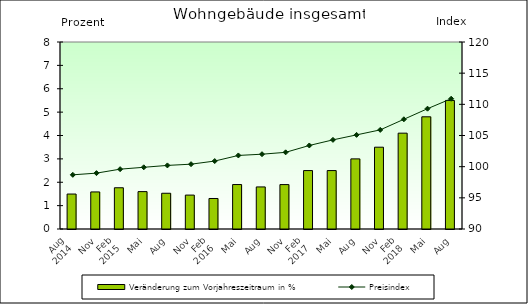
| Category | Veränderung zum Vorjahreszeitraum in % |
|---|---|
| 0 | 1.495 |
| 1 | 1.586 |
| 2 | 1.764 |
| 3 | 1.599 |
| 4 | 1.529 |
| 5 | 1.451 |
| 6 | 1.305 |
| 7 | 1.902 |
| 8 | 1.8 |
| 9 | 1.9 |
| 10 | 2.5 |
| 11 | 2.5 |
| 12 | 3 |
| 13 | 3.5 |
| 14 | 4.1 |
| 15 | 4.8 |
| 16 | 5.5 |